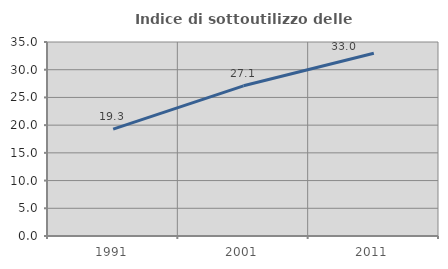
| Category | Indice di sottoutilizzo delle abitazioni  |
|---|---|
| 1991.0 | 19.284 |
| 2001.0 | 27.095 |
| 2011.0 | 32.968 |